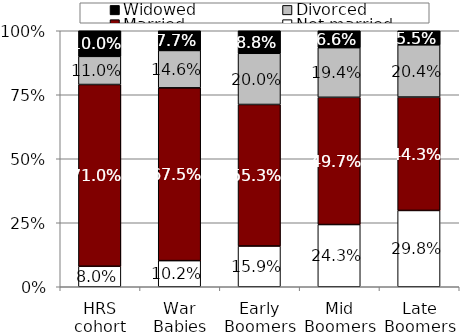
| Category | Not married | Married | Divorced | Widowed |
|---|---|---|---|---|
| HRS cohort | 0.08 | 0.71 | 0.11 | 0.1 |
| War Babies | 0.102 | 0.675 | 0.146 | 0.077 |
| Early Boomers | 0.159 | 0.553 | 0.2 | 0.088 |
| Mid Boomers | 0.243 | 0.497 | 0.194 | 0.066 |
| Late Boomers | 0.298 | 0.443 | 0.204 | 0.055 |